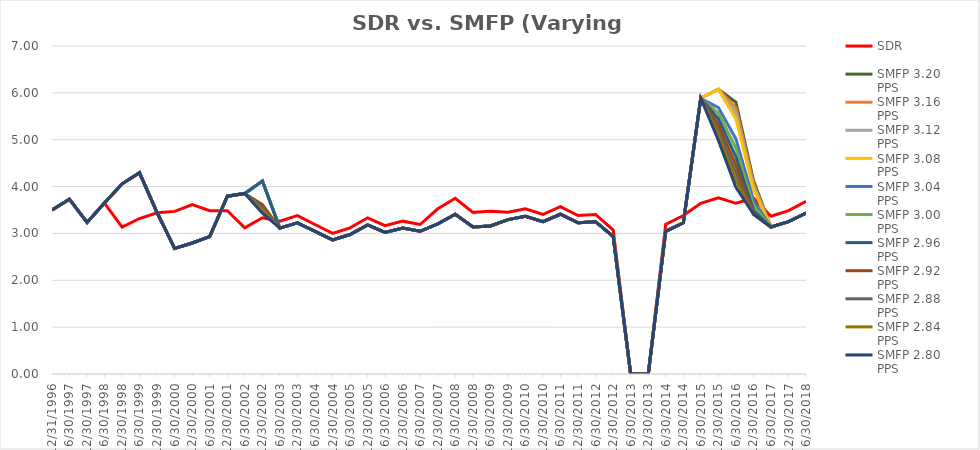
| Category | SDR | SMFP 3.20 PPS | SMFP 3.16 PPS | SMFP 3.12 PPS | SMFP 3.08 PPS | SMFP 3.04 PPS | SMFP 3.00 PPS | SMFP 2.96 PPS | SMFP 2.92 PPS | SMFP 2.88 PPS | SMFP 2.84 PPS | SMFP 2.80 PPS |
|---|---|---|---|---|---|---|---|---|---|---|---|---|
| 12/31/96 | 3.5 | 3.5 | 3.5 | 3.5 | 3.5 | 3.5 | 3.5 | 3.5 | 3.5 | 3.5 | 3.5 | 3.5 |
| 6/30/97 | 3.731 | 3.731 | 3.731 | 3.731 | 3.731 | 3.731 | 3.731 | 3.731 | 3.731 | 3.731 | 3.731 | 3.731 |
| 12/31/97 | 3.235 | 3.235 | 3.235 | 3.235 | 3.235 | 3.235 | 3.235 | 3.235 | 3.235 | 3.235 | 3.235 | 3.235 |
| 6/30/98 | 3.647 | 3.647 | 3.647 | 3.647 | 3.647 | 3.647 | 3.647 | 3.647 | 3.647 | 3.647 | 3.647 | 3.647 |
| 12/31/98 | 3.136 | 4.059 | 4.059 | 4.059 | 4.059 | 4.059 | 4.059 | 4.059 | 4.059 | 4.059 | 4.059 | 4.059 |
| 6/30/99 | 3.318 | 4.294 | 4.294 | 4.294 | 4.294 | 4.294 | 4.294 | 4.294 | 4.294 | 4.294 | 4.294 | 4.294 |
| 12/31/99 | 3.441 | 3.441 | 3.441 | 3.441 | 3.441 | 3.441 | 3.441 | 3.441 | 3.441 | 3.441 | 3.441 | 3.441 |
| 6/30/00 | 3.471 | 2.682 | 2.682 | 2.682 | 2.682 | 2.682 | 2.682 | 2.682 | 2.682 | 2.682 | 2.682 | 2.682 |
| 12/31/00 | 3.618 | 2.795 | 2.795 | 2.795 | 2.795 | 2.795 | 2.795 | 2.795 | 2.795 | 2.795 | 2.795 | 2.795 |
| 6/30/01 | 3.486 | 2.932 | 2.932 | 2.932 | 2.932 | 2.932 | 2.932 | 2.932 | 2.932 | 2.932 | 2.932 | 2.932 |
| 12/31/01 | 3.486 | 3.794 | 3.794 | 3.794 | 3.794 | 3.794 | 3.794 | 3.794 | 3.794 | 3.794 | 3.794 | 3.794 |
| 6/30/02 | 3.119 | 3.853 | 3.853 | 3.853 | 3.853 | 3.853 | 3.853 | 3.853 | 3.853 | 3.853 | 3.853 | 3.853 |
| 12/31/02 | 3.333 | 4.118 | 4.118 | 4.118 | 4.118 | 4.118 | 4.118 | 4.118 | 3.617 | 3.555 | 3.493 | 3.432 |
| 6/30/03 | 3.262 | 3.114 | 3.114 | 3.114 | 3.114 | 3.114 | 3.114 | 3.114 | 3.114 | 3.114 | 3.114 | 3.114 |
| 12/31/03 | 3.381 | 3.227 | 3.227 | 3.227 | 3.227 | 3.227 | 3.227 | 3.227 | 3.227 | 3.227 | 3.227 | 3.227 |
| 6/30/04 | 3.19 | 3.045 | 3.045 | 3.045 | 3.045 | 3.045 | 3.045 | 3.045 | 3.045 | 3.045 | 3.045 | 3.045 |
| 12/31/04 | 3 | 2.864 | 2.864 | 2.864 | 2.864 | 2.864 | 2.864 | 2.864 | 2.864 | 2.864 | 2.864 | 2.864 |
| 6/30/05 | 3.119 | 2.977 | 2.977 | 2.977 | 2.977 | 2.977 | 2.977 | 2.977 | 2.977 | 2.977 | 2.977 | 2.977 |
| 12/31/05 | 3.333 | 3.182 | 3.182 | 3.182 | 3.182 | 3.182 | 3.182 | 3.182 | 3.182 | 3.182 | 3.182 | 3.182 |
| 6/30/06 | 3.167 | 3.023 | 3.023 | 3.023 | 3.023 | 3.023 | 3.023 | 3.023 | 3.023 | 3.023 | 3.023 | 3.023 |
| 12/31/06 | 3.262 | 3.114 | 3.114 | 3.114 | 3.114 | 3.114 | 3.114 | 3.114 | 3.114 | 3.114 | 3.114 | 3.114 |
| 6/30/07 | 3.19 | 3.045 | 3.045 | 3.045 | 3.045 | 3.045 | 3.045 | 3.045 | 3.045 | 3.045 | 3.045 | 3.045 |
| 12/31/07 | 3.525 | 3.205 | 3.205 | 3.205 | 3.205 | 3.205 | 3.205 | 3.205 | 3.205 | 3.205 | 3.205 | 3.205 |
| 6/30/08 | 3.75 | 3.409 | 3.409 | 3.409 | 3.409 | 3.409 | 3.409 | 3.409 | 3.409 | 3.409 | 3.409 | 3.409 |
| 12/31/08 | 3.45 | 3.136 | 3.136 | 3.136 | 3.136 | 3.136 | 3.136 | 3.136 | 3.136 | 3.136 | 3.136 | 3.136 |
| 6/30/09 | 3.475 | 3.159 | 3.159 | 3.159 | 3.159 | 3.159 | 3.159 | 3.159 | 3.159 | 3.159 | 3.159 | 3.159 |
| 12/31/09 | 3.452 | 3.295 | 3.295 | 3.295 | 3.295 | 3.295 | 3.295 | 3.295 | 3.295 | 3.295 | 3.295 | 3.295 |
| 6/30/10 | 3.524 | 3.364 | 3.364 | 3.364 | 3.364 | 3.364 | 3.364 | 3.364 | 3.364 | 3.364 | 3.364 | 3.364 |
| 12/31/10 | 3.405 | 3.25 | 3.25 | 3.25 | 3.25 | 3.25 | 3.25 | 3.25 | 3.25 | 3.25 | 3.25 | 3.25 |
| 6/30/11 | 3.571 | 3.409 | 3.409 | 3.409 | 3.409 | 3.409 | 3.409 | 3.409 | 3.409 | 3.409 | 3.409 | 3.409 |
| 12/31/11 | 3.381 | 3.227 | 3.227 | 3.227 | 3.227 | 3.227 | 3.227 | 3.227 | 3.227 | 3.227 | 3.227 | 3.227 |
| 6/30/12 | 3.405 | 3.25 | 3.25 | 3.25 | 3.25 | 3.25 | 3.25 | 3.25 | 3.25 | 3.25 | 3.25 | 3.25 |
| 12/31/12 | 3.071 | 2.932 | 2.932 | 2.932 | 2.932 | 2.932 | 2.932 | 2.932 | 2.932 | 2.932 | 2.932 | 2.932 |
| 6/30/13 | 0 | 0 | 0 | 0 | 0 | 0 | 0 | 0 | 0 | 0 | 0 | 0 |
| 12/31/13 | 0 | 0 | 0 | 0 | 0 | 0 | 0 | 0 | 0 | 0 | 0 | 0 |
| 6/30/14 | 3.19 | 3.045 | 3.045 | 3.045 | 3.045 | 3.045 | 3.045 | 3.045 | 3.045 | 3.045 | 3.045 | 3.045 |
| 12/31/14 | 3.381 | 3.227 | 3.227 | 3.227 | 3.227 | 3.227 | 3.227 | 3.227 | 3.227 | 3.227 | 3.227 | 3.227 |
| 6/30/15 | 3.643 | 5.885 | 5.885 | 5.885 | 5.885 | 5.885 | 5.885 | 5.885 | 5.885 | 5.885 | 5.885 | 5.885 |
| 12/31/15 | 3.762 | 6.077 | 6.077 | 6.077 | 6.077 | 5.686 | 5.564 | 5.444 | 5.325 | 5.209 | 5.095 | 4.982 |
| 6/30/16 | 3.643 | 5.801 | 5.68 | 5.561 | 5.444 | 5.017 | 4.822 | 4.637 | 4.461 | 4.293 | 4.134 | 3.982 |
| 12/31/16 | 3.75 | 4.124 | 4.061 | 3.999 | 3.937 | 3.704 | 3.594 | 3.489 | 3.409 | 3.409 | 3.409 | 3.409 |
| 6/30/17 | 3.366 | 3.136 | 3.136 | 3.136 | 3.136 | 3.136 | 3.136 | 3.136 | 3.136 | 3.136 | 3.136 | 3.136 |
| 12/31/17 | 3.488 | 3.25 | 3.25 | 3.25 | 3.25 | 3.25 | 3.25 | 3.25 | 3.25 | 3.25 | 3.25 | 3.25 |
| 6/30/18 | 3.683 | 3.432 | 3.432 | 3.432 | 3.432 | 3.432 | 3.432 | 3.432 | 3.432 | 3.432 | 3.432 | 3.432 |